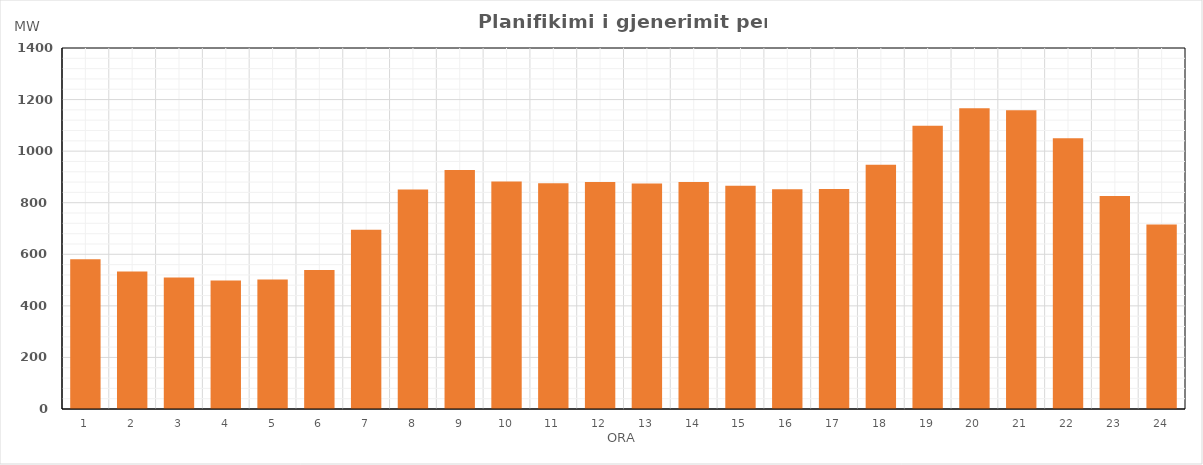
| Category | Max (MW) |
|---|---|
| 0 | 581.19 |
| 1 | 533.28 |
| 2 | 509.76 |
| 3 | 498.38 |
| 4 | 501.84 |
| 5 | 539.07 |
| 6 | 695.09 |
| 7 | 851.48 |
| 8 | 926.51 |
| 9 | 882.43 |
| 10 | 875.58 |
| 11 | 880.77 |
| 12 | 875 |
| 13 | 880.48 |
| 14 | 866.08 |
| 15 | 851.97 |
| 16 | 853.18 |
| 17 | 947.27 |
| 18 | 1098.33 |
| 19 | 1166.68 |
| 20 | 1158.99 |
| 21 | 1050.37 |
| 22 | 825.84 |
| 23 | 715.97 |